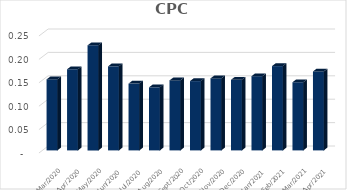
| Category | CPC |
|---|---|
| 2021-04-30 | 0.169 |
| 2021-03-31 | 0.146 |
| 2021-02-28 | 0.18 |
| 2021-01-31 | 0.159 |
| 2020-12-31 | 0.151 |
| 2020-11-30 | 0.154 |
| 2020-10-31 | 0.148 |
| 2020-09-30 | 0.15 |
| 2020-08-31 | 0.135 |
| 2020-07-31 | 0.143 |
| 2020-06-30 | 0.18 |
| 2020-05-31 | 0.224 |
| 2020-04-30 | 0.173 |
| 2020-03-31 | 0.152 |